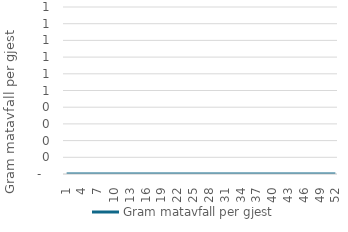
| Category | Gram matavfall per gjest |
|---|---|
| 1.0 | 0 |
| 2.0 | 0 |
| 3.0 | 0 |
| 4.0 | 0 |
| 5.0 | 0 |
| 6.0 | 0 |
| 7.0 | 0 |
| 8.0 | 0 |
| 9.0 | 0 |
| 10.0 | 0 |
| 11.0 | 0 |
| 12.0 | 0 |
| 13.0 | 0 |
| 14.0 | 0 |
| 15.0 | 0 |
| 16.0 | 0 |
| 17.0 | 0 |
| 18.0 | 0 |
| 19.0 | 0 |
| 20.0 | 0 |
| 21.0 | 0 |
| 22.0 | 0 |
| 23.0 | 0 |
| 24.0 | 0 |
| 25.0 | 0 |
| 26.0 | 0 |
| 27.0 | 0 |
| 28.0 | 0 |
| 29.0 | 0 |
| 30.0 | 0 |
| 31.0 | 0 |
| 32.0 | 0 |
| 33.0 | 0 |
| 34.0 | 0 |
| 35.0 | 0 |
| 36.0 | 0 |
| 37.0 | 0 |
| 38.0 | 0 |
| 39.0 | 0 |
| 40.0 | 0 |
| 41.0 | 0 |
| 42.0 | 0 |
| 43.0 | 0 |
| 44.0 | 0 |
| 45.0 | 0 |
| 46.0 | 0 |
| 47.0 | 0 |
| 48.0 | 0 |
| 49.0 | 0 |
| 50.0 | 0 |
| 51.0 | 0 |
| 52.0 | 0 |